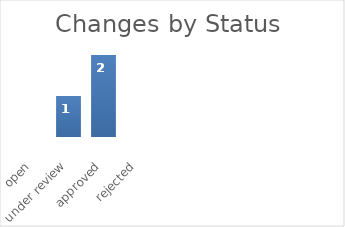
| Category | open |
|---|---|
| open | 0 |
| under review | 1 |
| approved | 2 |
| rejected | 0 |